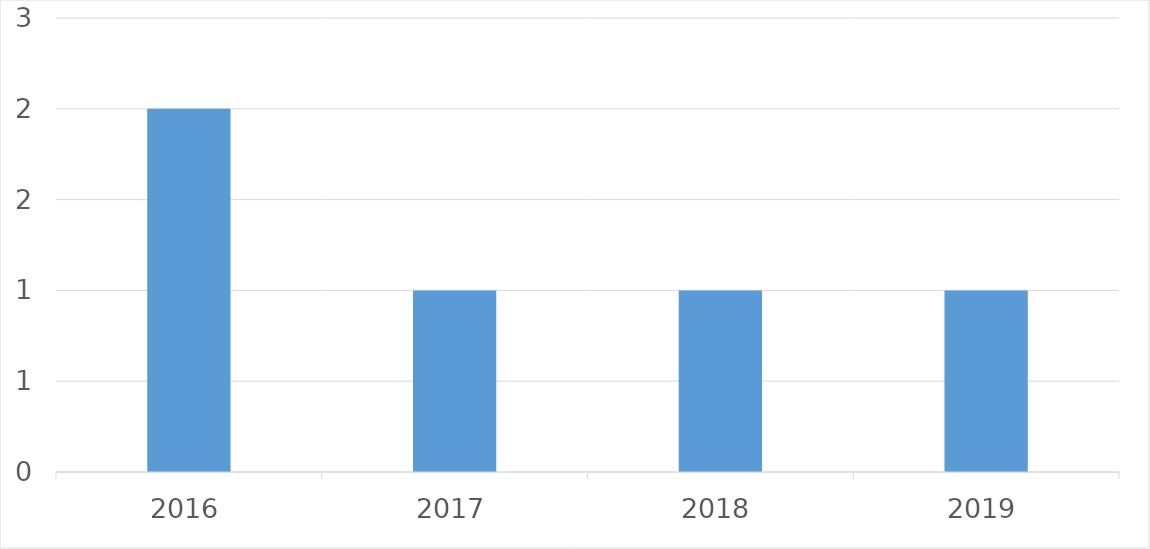
| Category | Series 0 |
|---|---|
| 2016 | 2 |
| 2017 | 1 |
| 2018 | 1 |
| 2019 | 1 |